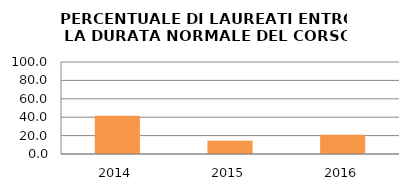
| Category | 2014 2015 2016 |
|---|---|
| 2014.0 | 41.463 |
| 2015.0 | 14.286 |
| 2016.0 | 20.833 |